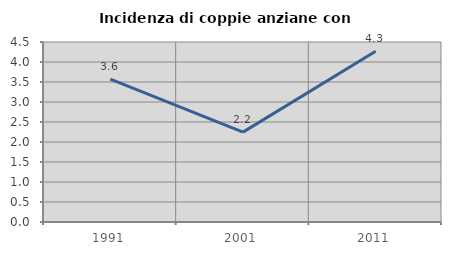
| Category | Incidenza di coppie anziane con figli |
|---|---|
| 1991.0 | 3.571 |
| 2001.0 | 2.247 |
| 2011.0 | 4.268 |